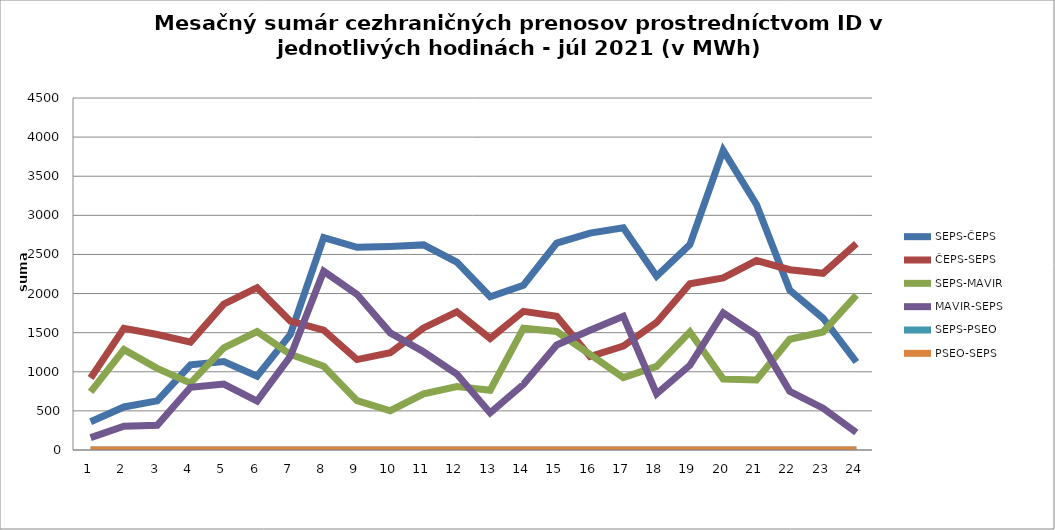
| Category | SEPS-ČEPS | ČEPS-SEPS | SEPS-MAVIR | MAVIR-SEPS | SEPS-PSEO | PSEO-SEPS |
|---|---|---|---|---|---|---|
| 1.0 | 361 | 921 | 743 | 159 | 0 | 0 |
| 2.0 | 550 | 1556 | 1283 | 303 | 0 | 0 |
| 3.0 | 628 | 1476 | 1043 | 316 | 0 | 0 |
| 4.0 | 1089 | 1379 | 855 | 802 | 0 | 0 |
| 5.0 | 1132 | 1865 | 1306 | 843 | 0 | 0 |
| 6.0 | 943 | 2075 | 1514 | 626 | 0 | 0 |
| 7.0 | 1479 | 1647 | 1223 | 1198 | 0 | 0 |
| 8.0 | 2716 | 1531 | 1070 | 2285 | 0 | 0 |
| 9.0 | 2592 | 1156 | 631 | 1990 | 0 | 0 |
| 10.0 | 2603 | 1244 | 502 | 1497 | 0 | 0 |
| 11.0 | 2622 | 1560 | 717 | 1256 | 0 | 0 |
| 12.0 | 2401 | 1766 | 810 | 971 | 0 | 0 |
| 13.0 | 1959 | 1426 | 765 | 474 | 0 | 0 |
| 14.0 | 2107 | 1772 | 1556 | 839 | 0 | 0 |
| 15.0 | 2645 | 1711 | 1515 | 1343 | 0 | 0 |
| 16.0 | 2773 | 1195 | 1222 | 1531 | 0 | 0 |
| 17.0 | 2840 | 1327 | 926 | 1709 | 0 | 0 |
| 18.0 | 2222 | 1631 | 1069 | 718 | 0 | 0 |
| 19.0 | 2626 | 2125 | 1510 | 1083 | 0 | 0 |
| 20.0 | 3830 | 2200 | 907 | 1754 | 0 | 0 |
| 21.0 | 3139 | 2422 | 895 | 1469 | 0 | 0 |
| 22.0 | 2042 | 2305 | 1416 | 751 | 0 | 0 |
| 23.0 | 1685 | 2259 | 1509 | 535 | 0 | 0 |
| 24.0 | 1125 | 2638 | 1979 | 224 | 0 | 0 |